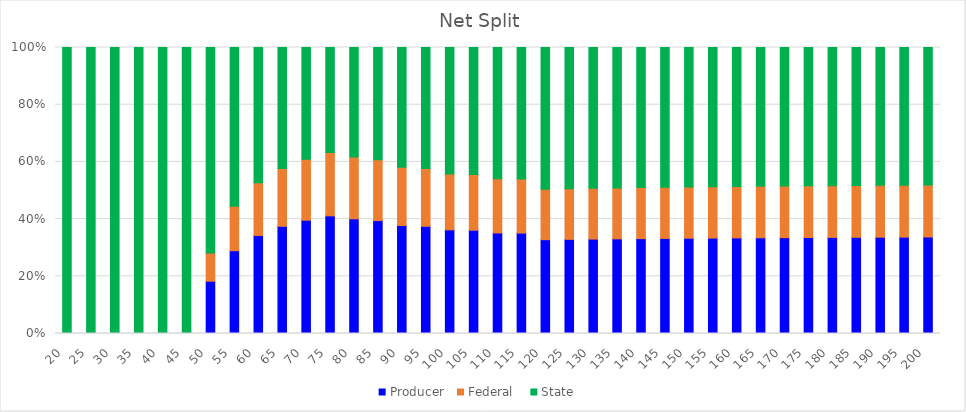
| Category | Producer  | Federal   | State   |
|---|---|---|---|
| 20.0 | 0 | 0 | 1 |
| 25.0 | 0 | 0 | 1 |
| 30.0 | 0 | 0 | 1 |
| 35.0 | 0 | 0 | 1 |
| 40.0 | 0 | 0 | 1 |
| 45.0 | 0 | 0 | 1 |
| 50.0 | 0.183 | 0.098 | 0.719 |
| 55.0 | 0.289 | 0.156 | 0.555 |
| 60.0 | 0.343 | 0.185 | 0.473 |
| 65.0 | 0.375 | 0.202 | 0.423 |
| 70.0 | 0.396 | 0.213 | 0.391 |
| 75.0 | 0.411 | 0.221 | 0.367 |
| 80.0 | 0.401 | 0.216 | 0.383 |
| 85.0 | 0.395 | 0.213 | 0.393 |
| 90.0 | 0.378 | 0.203 | 0.419 |
| 95.0 | 0.375 | 0.202 | 0.423 |
| 100.0 | 0.362 | 0.195 | 0.442 |
| 105.0 | 0.361 | 0.195 | 0.444 |
| 110.0 | 0.351 | 0.189 | 0.459 |
| 115.0 | 0.351 | 0.189 | 0.46 |
| 120.0 | 0.328 | 0.177 | 0.495 |
| 125.0 | 0.329 | 0.177 | 0.494 |
| 130.0 | 0.33 | 0.178 | 0.492 |
| 135.0 | 0.331 | 0.178 | 0.491 |
| 140.0 | 0.332 | 0.179 | 0.49 |
| 145.0 | 0.332 | 0.179 | 0.489 |
| 150.0 | 0.333 | 0.179 | 0.488 |
| 155.0 | 0.334 | 0.18 | 0.487 |
| 160.0 | 0.334 | 0.18 | 0.486 |
| 165.0 | 0.335 | 0.18 | 0.485 |
| 170.0 | 0.335 | 0.18 | 0.484 |
| 175.0 | 0.336 | 0.181 | 0.484 |
| 180.0 | 0.336 | 0.181 | 0.483 |
| 185.0 | 0.336 | 0.181 | 0.483 |
| 190.0 | 0.337 | 0.181 | 0.482 |
| 195.0 | 0.337 | 0.181 | 0.482 |
| 200.0 | 0.337 | 0.182 | 0.481 |